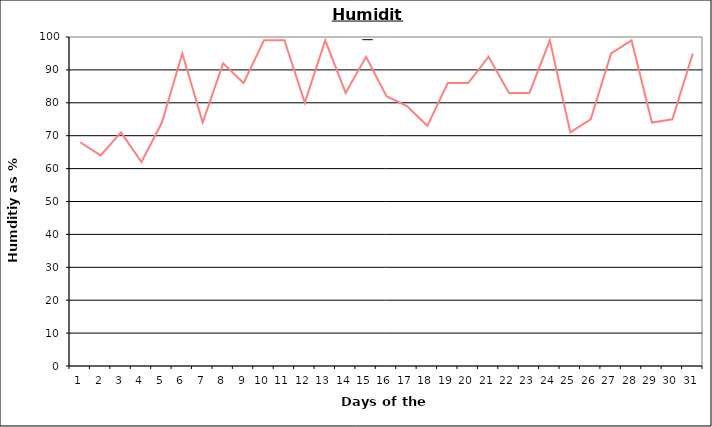
| Category | Series 0 |
|---|---|
| 0 | 68 |
| 1 | 64 |
| 2 | 71 |
| 3 | 62 |
| 4 | 74 |
| 5 | 95 |
| 6 | 74 |
| 7 | 92 |
| 8 | 86 |
| 9 | 99 |
| 10 | 99 |
| 11 | 80 |
| 12 | 99 |
| 13 | 83 |
| 14 | 94 |
| 15 | 82 |
| 16 | 79 |
| 17 | 73 |
| 18 | 86 |
| 19 | 86 |
| 20 | 94 |
| 21 | 83 |
| 22 | 83 |
| 23 | 99 |
| 24 | 71 |
| 25 | 75 |
| 26 | 95 |
| 27 | 99 |
| 28 | 74 |
| 29 | 75 |
| 30 | 95 |